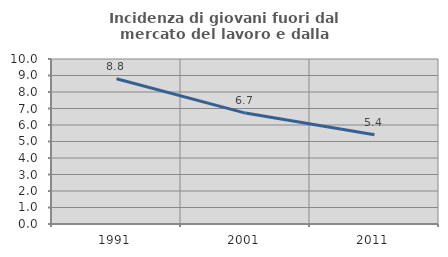
| Category | Incidenza di giovani fuori dal mercato del lavoro e dalla formazione  |
|---|---|
| 1991.0 | 8.801 |
| 2001.0 | 6.721 |
| 2011.0 | 5.405 |